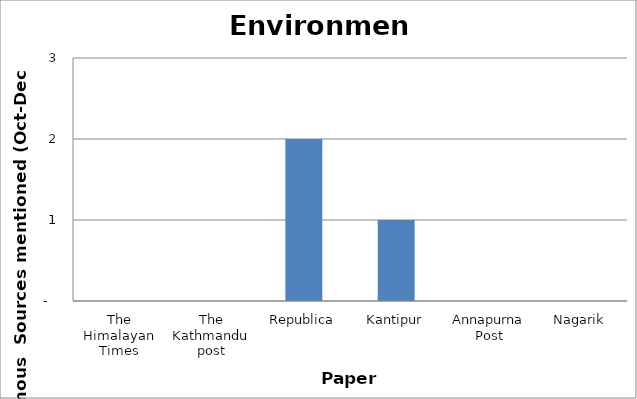
| Category | Environment |
|---|---|
| The Himalayan Times | 0 |
| The Kathmandu post | 0 |
| Republica | 2 |
| Kantipur | 1 |
| Annapurna Post | 0 |
| Nagarik | 0 |